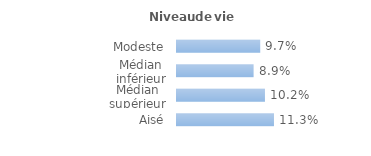
| Category | Series 0 |
|---|---|
| Modeste | 0.097 |
| Médian inférieur | 0.089 |
| Médian supérieur | 0.102 |
| Aisé | 0.113 |